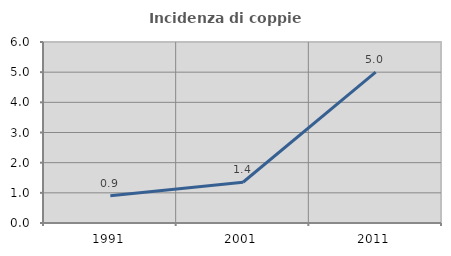
| Category | Incidenza di coppie miste |
|---|---|
| 1991.0 | 0.905 |
| 2001.0 | 1.351 |
| 2011.0 | 5 |